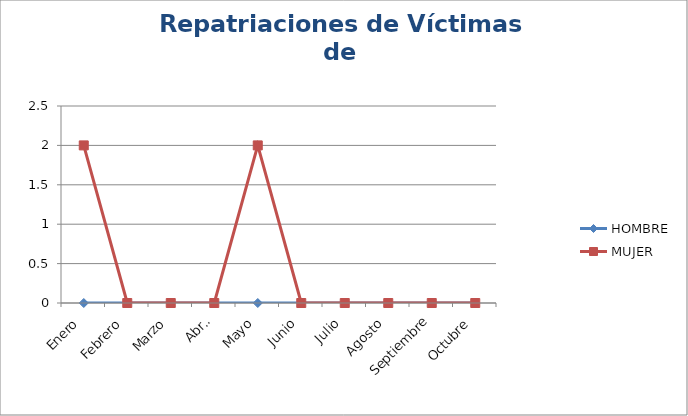
| Category | HOMBRE | MUJER |
|---|---|---|
| Enero | 0 | 2 |
| Febrero | 0 | 0 |
| Marzo | 0 | 0 |
| Abril | 0 | 0 |
| Mayo | 0 | 2 |
| Junio | 0 | 0 |
| Julio | 0 | 0 |
| Agosto | 0 | 0 |
| Septiembre | 0 | 0 |
| Octubre | 0 | 0 |